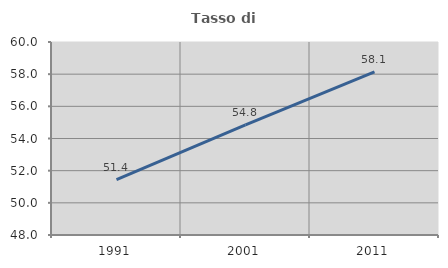
| Category | Tasso di occupazione   |
|---|---|
| 1991.0 | 51.441 |
| 2001.0 | 54.846 |
| 2011.0 | 58.138 |